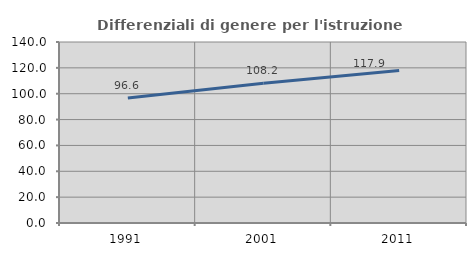
| Category | Differenziali di genere per l'istruzione superiore |
|---|---|
| 1991.0 | 96.623 |
| 2001.0 | 108.183 |
| 2011.0 | 117.949 |